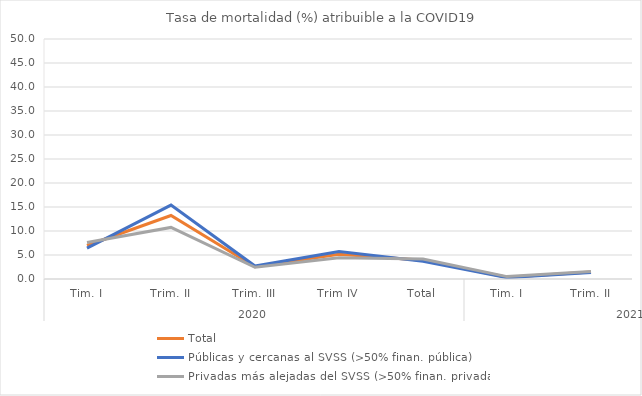
| Category | Total | Públicas y cercanas al SVSS (>50% finan. pública) | Privadas más alejadas del SVSS (>50% finan. privada) |
|---|---|---|---|
| 0 | 6.979 | 6.446 | 7.592 |
| 1 | 13.228 | 15.39 | 10.746 |
| 2 | 2.57 | 2.692 | 2.431 |
| 3 | 5.144 | 5.747 | 4.451 |
| 4 | 3.914 | 3.7 | 4.156 |
| 5 | 0.385 | 0.288 | 0.499 |
| 6 | 1.463 | 1.369 | 1.571 |